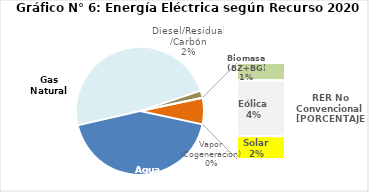
| Category | Series 0 |
|---|---|
| Agua | 1919.752 |
| Gas Natural | 2160.867 |
| Diesel/Residual/Carbón | 79.217 |
| Vapor (Cogeneracion) | 0.185 |
| Biomasa (BZ+BG) | 54.03 |
| Eólica | 174.345 |
| Solar | 70.454 |